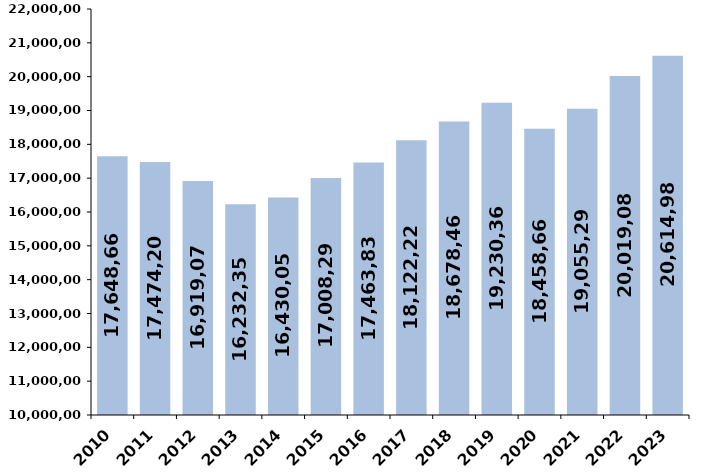
| Category | % de variación
 interanual |
|---|---|
| 2010.0 | 17648660.1 |
| 2011.0 | 17474200.78 |
| 2012.0 | 16919079.21 |
| 2013.0 | 16232352.31 |
| 2014.0 | 16430052.95 |
| 2015.0 | 17008295.9 |
| 2016.0 | 17463835.63 |
| 2017.0 | 18122222.3 |
| 2018.0 | 18678460.85 |
| 2019.0 | 19230361.75 |
| 2020.0 | 18458666.8 |
| 2021.0 | 19055298 |
| 2022.0 | 20019080 |
| 2023.0 | 20614988.556 |